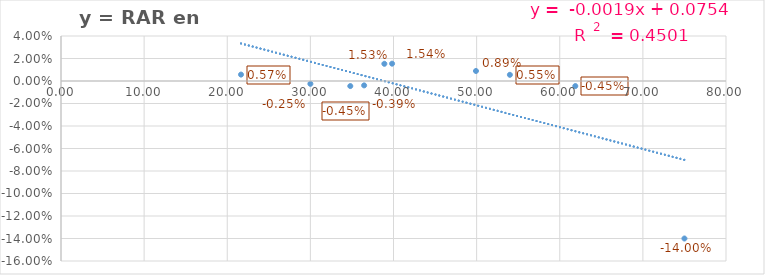
| Category | y = RAR en Mort |
|---|---|
| 38.9 | 0.015 |
| 39.8298530549111 | 0.015 |
| 54.0 | 0.006 |
| 61.8716163959784 | -0.004 |
| 21.6550657385924 | 0.006 |
| 75.0 | -0.14 |
| 36.4663451291327 | -0.004 |
| 34.8027842227378 | -0.004 |
| 30.0 | -0.002 |
| 49.92 | 0.009 |